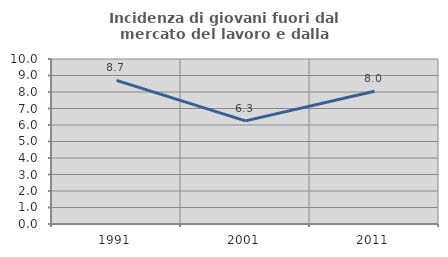
| Category | Incidenza di giovani fuori dal mercato del lavoro e dalla formazione  |
|---|---|
| 1991.0 | 8.701 |
| 2001.0 | 6.25 |
| 2011.0 | 8.043 |